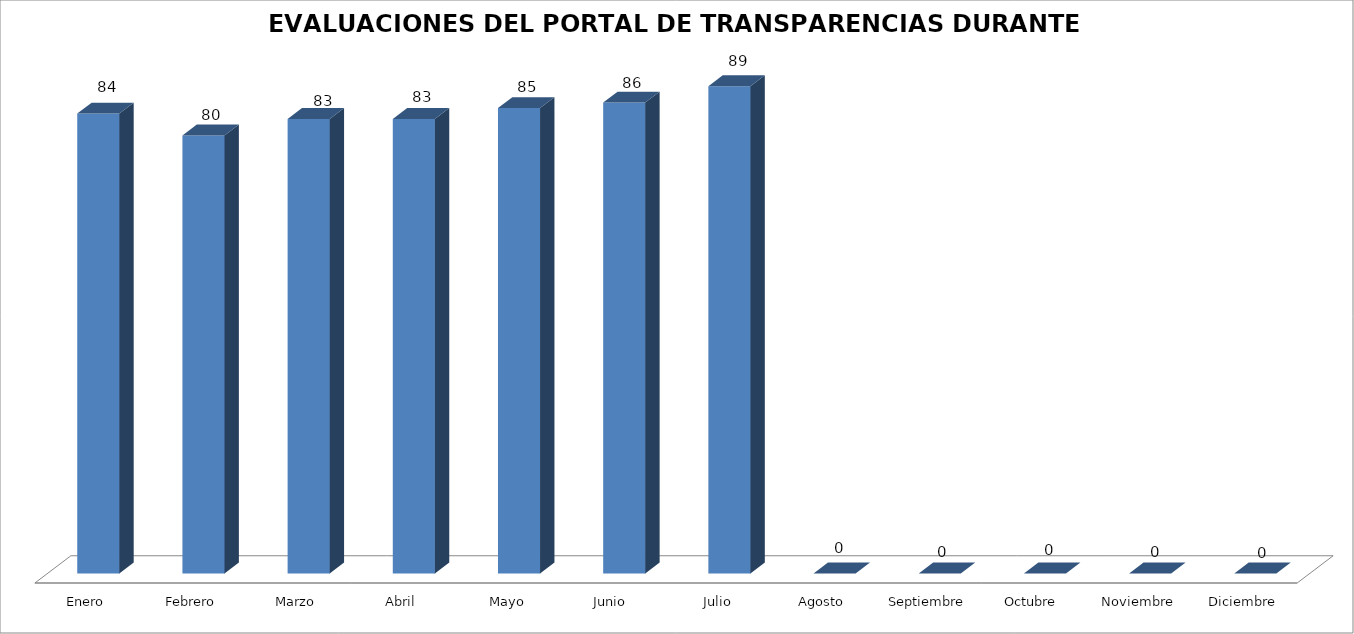
| Category | Series 0 |
|---|---|
| Enero | 84 |
| Febrero | 80 |
| Marzo | 83 |
| Abril | 83 |
| Mayo | 85 |
| Junio  | 86 |
| Julio | 89 |
| Agosto | 0 |
| Septiembre | 0 |
| Octubre  | 0 |
| Noviembre | 0 |
| Diciembre | 0 |